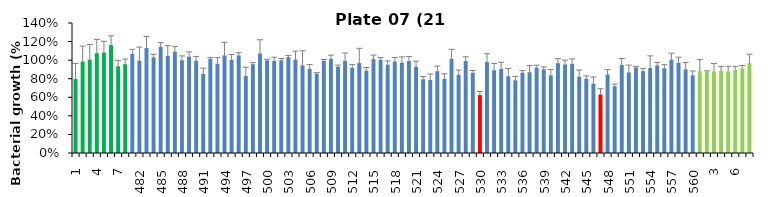
| Category | 21 h % |
|---|---|
| 1.0 | 0.798 |
| 2.0 | 0.985 |
| 3.0 | 1.006 |
| 4.0 | 1.076 |
| 5.0 | 1.082 |
| 6.0 | 1.162 |
| 7.0 | 0.935 |
| 8.0 | 0.957 |
| 481.0 | 1.068 |
| 482.0 | 0.994 |
| 483.0 | 1.132 |
| 484.0 | 1.031 |
| 485.0 | 1.145 |
| 486.0 | 1.047 |
| 487.0 | 1.092 |
| 488.0 | 0.999 |
| 489.0 | 1.038 |
| 490.0 | 0.992 |
| 491.0 | 0.853 |
| 492.0 | 1.016 |
| 493.0 | 0.962 |
| 494.0 | 1.051 |
| 495.0 | 1.004 |
| 496.0 | 1.051 |
| 497.0 | 0.828 |
| 498.0 | 0.957 |
| 499.0 | 1.072 |
| 500.0 | 0.998 |
| 501.0 | 0.991 |
| 502.0 | 0.999 |
| 503.0 | 1.033 |
| 504.0 | 1.006 |
| 505.0 | 0.944 |
| 506.0 | 0.907 |
| 507.0 | 0.855 |
| 508.0 | 0.994 |
| 509.0 | 1.015 |
| 510.0 | 0.93 |
| 511.0 | 0.992 |
| 512.0 | 0.917 |
| 513.0 | 0.968 |
| 514.0 | 0.888 |
| 515.0 | 1.011 |
| 516.0 | 1.006 |
| 517.0 | 0.951 |
| 518.0 | 0.985 |
| 519.0 | 0.973 |
| 520.0 | 0.991 |
| 521.0 | 0.929 |
| 522.0 | 0.794 |
| 523.0 | 0.787 |
| 524.0 | 0.881 |
| 525.0 | 0.798 |
| 526.0 | 1.015 |
| 527.0 | 0.842 |
| 528.0 | 0.991 |
| 529.0 | 0.865 |
| 530.0 | 0.624 |
| 531.0 | 0.98 |
| 532.0 | 0.892 |
| 533.0 | 0.906 |
| 534.0 | 0.828 |
| 535.0 | 0.783 |
| 536.0 | 0.865 |
| 537.0 | 0.87 |
| 538.0 | 0.919 |
| 539.0 | 0.902 |
| 540.0 | 0.836 |
| 541.0 | 0.968 |
| 542.0 | 0.953 |
| 543.0 | 0.96 |
| 544.0 | 0.822 |
| 545.0 | 0.8 |
| 546.0 | 0.747 |
| 547.0 | 0.63 |
| 548.0 | 0.846 |
| 549.0 | 0.719 |
| 550.0 | 0.947 |
| 551.0 | 0.868 |
| 552.0 | 0.922 |
| 553.0 | 0.882 |
| 554.0 | 0.916 |
| 555.0 | 0.944 |
| 556.0 | 0.913 |
| 557.0 | 1.005 |
| 558.0 | 0.971 |
| 559.0 | 0.901 |
| 560.0 | 0.836 |
| 1.0 | 0.881 |
| 2.0 | 0.875 |
| 3.0 | 0.879 |
| 4.0 | 0.884 |
| 5.0 | 0.88 |
| 6.0 | 0.897 |
| 7.0 | 0.911 |
| 8.0 | 0.968 |